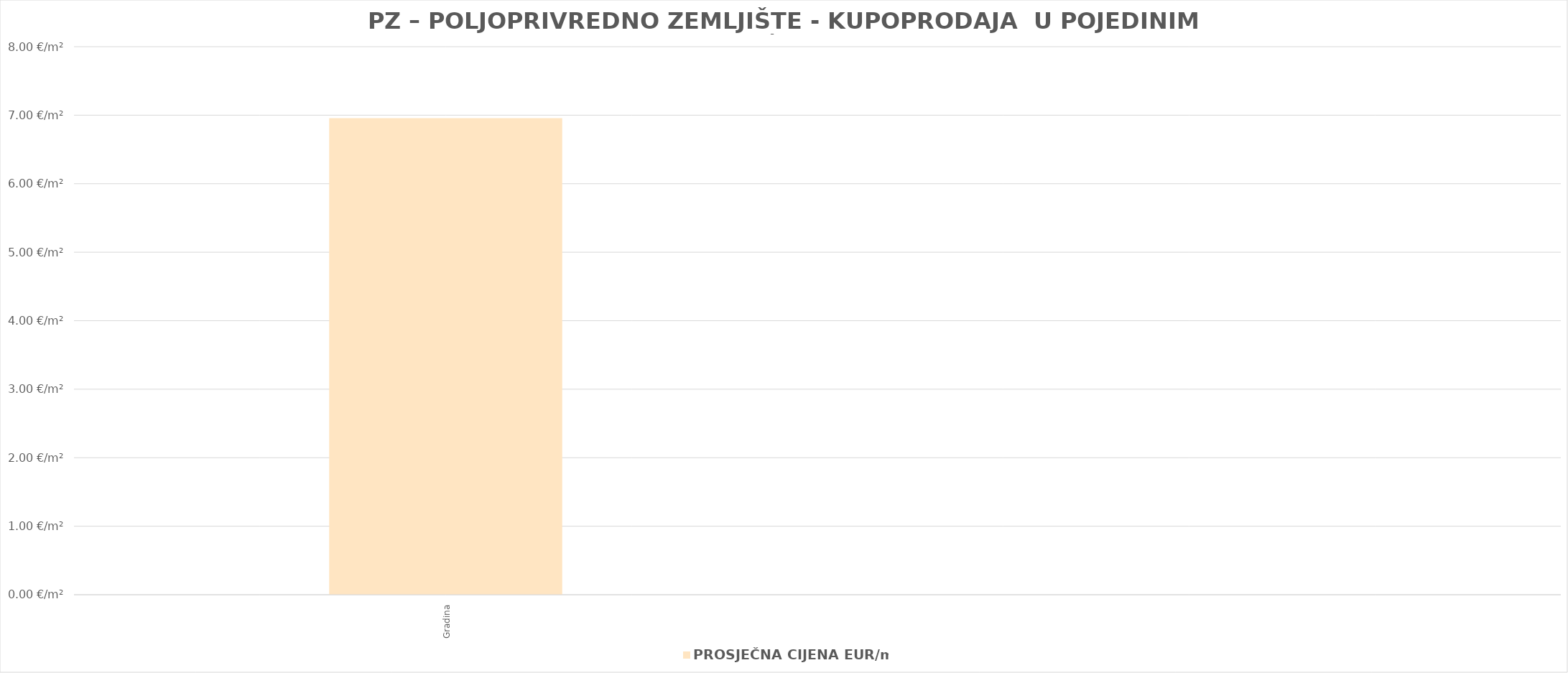
| Category | PROSJEČNA CIJENA EUR/m2 |
|---|---|
| Gradina | 1900-01-06 22:57:29 |